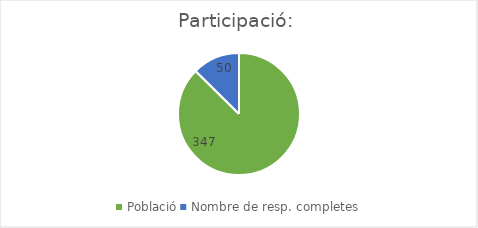
| Category | Series 0 |
|---|---|
| Població | 347 |
| Nombre de resp. completes | 50 |